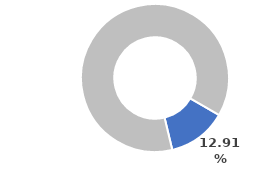
| Category | Series 0 |
|---|---|
| 0 | 0.129 |
| 1 | 0.871 |